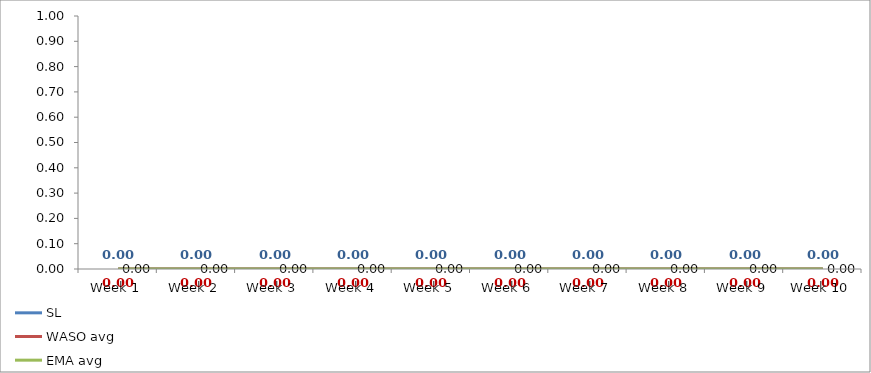
| Category | SL | WASO avg | EMA avg |
|---|---|---|---|
| Week 1 | 0 | 0 | 0 |
| Week 2 | 0 | 0 | 0 |
| Week 3 | 0 | 0 | 0 |
| Week 4 | 0 | 0 | 0 |
| Week 5 | 0 | 0 | 0 |
| Week 6 | 0 | 0 | 0 |
| Week 7 | 0 | 0 | 0 |
| Week 8 | 0 | 0 | 0 |
| Week 9 | 0 | 0 | 0 |
| Week 10 | 0 | 0 | 0 |